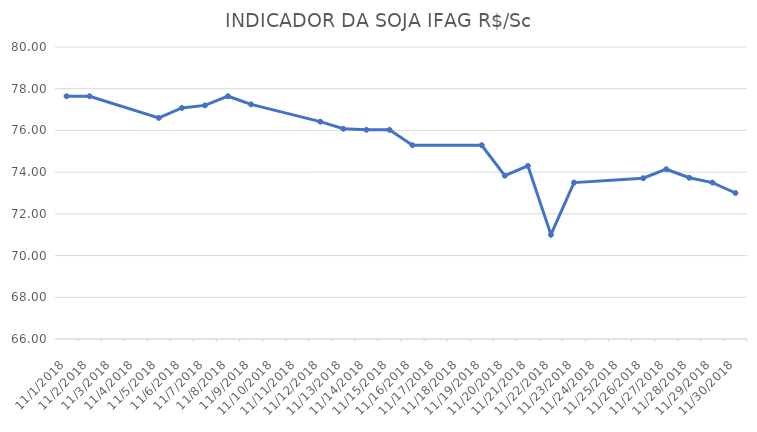
| Category | INDICADOR DA SOJA IFAG |
|---|---|
| 11/1/18 | 77.64 |
| 11/2/18 | 77.64 |
| 11/5/18 | 76.6 |
| 11/6/18 | 77.08 |
| 11/7/18 | 77.2 |
| 11/8/18 | 77.64 |
| 11/9/18 | 77.25 |
| 11/12/18 | 76.42 |
| 11/13/18 | 76.08 |
| 11/14/18 | 76.03 |
| 11/15/18 | 76.03 |
| 11/16/18 | 75.29 |
| 11/19/18 | 75.29 |
| 11/20/18 | 73.83 |
| 11/21/18 | 74.3 |
| 11/22/18 | 71 |
| 11/23/18 | 73.5 |
| 11/26/18 | 73.71 |
| 11/27/18 | 74.14 |
| 11/28/18 | 73.73 |
| 11/29/18 | 73.5 |
| 11/30/18 | 73 |